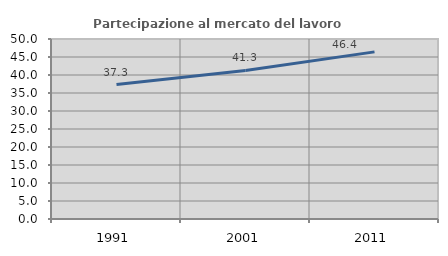
| Category | Partecipazione al mercato del lavoro  femminile |
|---|---|
| 1991.0 | 37.329 |
| 2001.0 | 41.255 |
| 2011.0 | 46.422 |